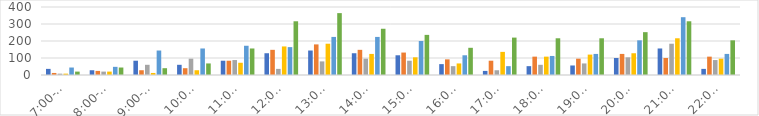
| Category | Series 0 | Series 1 | Series 2 | Series 3 | Series 4 | Series 5 |
|---|---|---|---|---|---|---|
| 7:00-8:00 | 36 | 12 | 8 | 8 | 44 | 20 |
| 8:00-9:00 | 28 | 24 | 20 | 20 | 48 | 44 |
| 9:00-10:00 | 84 | 28 | 60 | 12 | 144 | 40 |
| 10:00-11:00 | 60 | 40 | 96 | 28 | 156 | 68 |
| 11:00-12:00 | 84 | 84 | 88 | 72 | 172 | 156 |
| 12:00-13:00 | 128 | 148 | 36 | 168 | 164 | 316 |
| 13:00-14:00 | 144 | 180 | 80 | 184 | 224 | 364 |
| 14:00-15:00 | 128 | 148 | 96 | 124 | 224 | 272 |
| 15:00-16:00 | 116 | 132 | 84 | 104 | 200 | 236 |
| 16:00-17:00 | 64 | 92 | 52 | 68 | 116 | 160 |
| 17:00-18:00 | 24 | 84 | 28 | 136 | 52 | 220 |
| 18:00-19:00 | 52 | 108 | 60 | 108 | 112 | 216 |
| 19:00-20:00 | 56 | 96 | 68 | 120 | 124 | 216 |
| 20:00-21:00 | 100 | 124 | 104 | 128 | 204 | 252 |
| 21:00-22:00 | 156 | 100 | 184 | 216 | 340 | 316 |
| 22:00-23:00 | 36 | 108 | 88 | 96 | 124 | 204 |